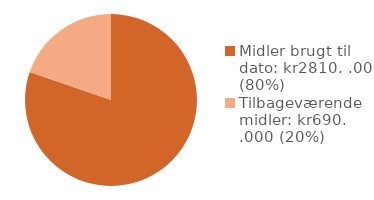
| Category | Series 0 |
|---|---|
| Midler brugt til dato: kr2810. .000 (80%) | 2810 |
| Tilbageværende midler: kr690. .000 (20%) | 690 |